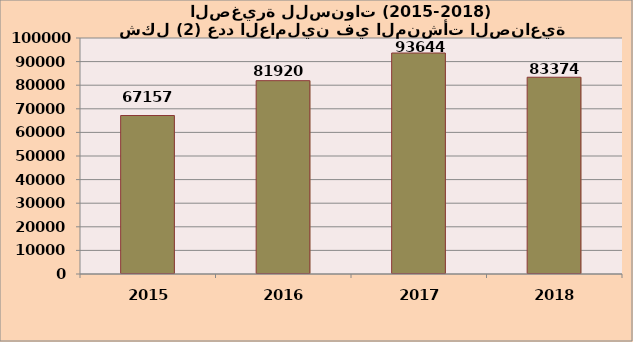
| Category | عدد العاملين |
|---|---|
| 2015.0 | 67157 |
| 2016.0 | 81920 |
| 2017.0 | 93644 |
| 2018.0 | 83374 |